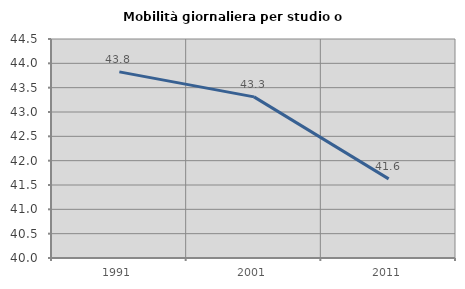
| Category | Mobilità giornaliera per studio o lavoro |
|---|---|
| 1991.0 | 43.825 |
| 2001.0 | 43.311 |
| 2011.0 | 41.626 |